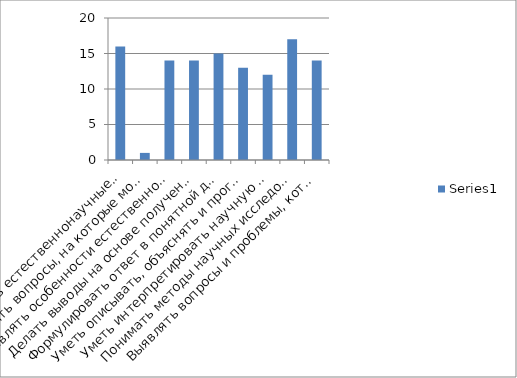
| Category | Series 0 |
|---|---|
| Использовать естественнонаучные знания в жизненных ситуациях; | 16 |
| Выявлять вопросы, на которые может ответить естествознание; | 1 |
| Выявлять особенности естественнонаучного исследования | 14 |
| Делать выводы на основе полученных данных | 14 |
| Формулировать ответ в понятной для всех форме | 15 |
| Уметь описывать, объяснять и прогнозировать естественнонаучные явления | 13 |
| Уметь интерпретировать научную аргументацию и выводы, с которыми они могут встретиться в средствах массовой информации | 12 |
| Понимать методы научных исследований | 17 |
| Выявлять вопросы и проблемы, которые могут быть решены с помощью научных методов. | 14 |